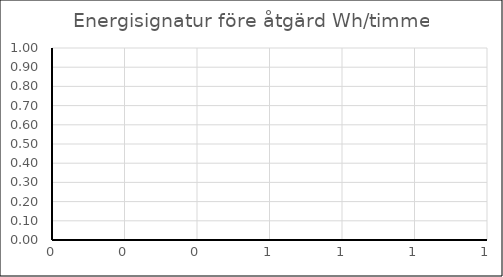
| Category | Före åtgärd |
|---|---|
|  | 0 |
|  | 0 |
|  | 0 |
|  | 0 |
|  | 0 |
|  | 0 |
|  | 0 |
|  | 0 |
|  | 0 |
|  | 0 |
|  | 0 |
|  | 0 |
|  | 0 |
|  | 0 |
|  | 0 |
|  | 0 |
|  | 0 |
|  | 0 |
|  | 0 |
|  | 0 |
|  | 0 |
|  | 0 |
|  | 0 |
|  | 0 |
|  | 0 |
|  | 0 |
|  | 0 |
|  | 0 |
|  | 0 |
|  | 0 |
|  | 0 |
|  | 0 |
|  | 0 |
|  | 0 |
|  | 0 |
|  | 0 |
|  | 0 |
|  | 0 |
|  | 0 |
|  | 0 |
|  | 0 |
|  | 0 |
|  | 0 |
|  | 0 |
|  | 0 |
|  | 0 |
|  | 0 |
|  | 0 |
|  | 0 |
|  | 0 |
|  | 0 |
|  | 0 |